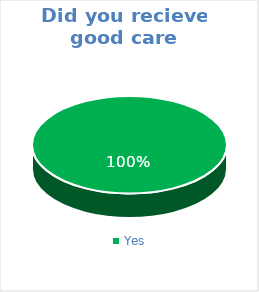
| Category | Did you recieve good care today? |
|---|---|
| Yes | 1 |